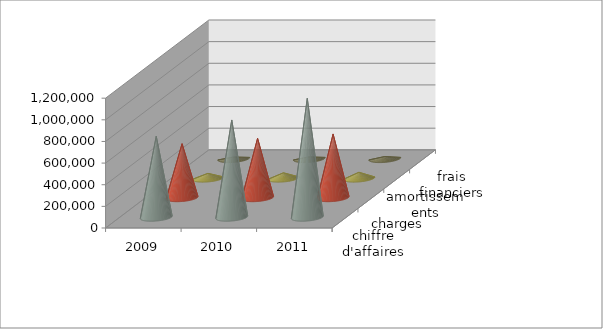
| Category | chiffre d'affaires | charges | amortissements | frais financiers |
|---|---|---|---|---|
| 2009 | 750000 | 500000 | 45000 | 15000 |
| 2010 | 900000 | 550000 | 50000 | 16000 |
| 2011 | 1100000 | 590000 | 55000 | 20000 |